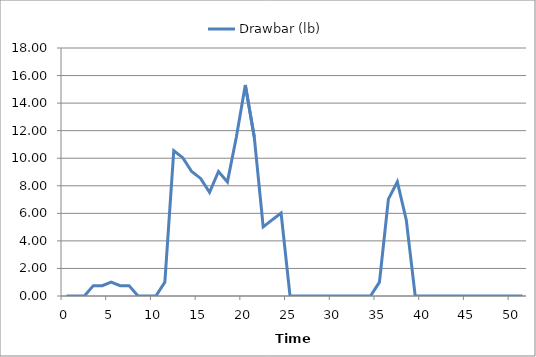
| Category | Drawbar (lb) |
|---|---|
| 0.0 | 0 |
| 1.0 | 0 |
| 2.0 | 0 |
| 3.0 | 0.753 |
| 4.0 | 0.753 |
| 5.0 | 1.004 |
| 6.0 | 0.753 |
| 7.0 | 0.753 |
| 8.0 | 0 |
| 9.0 | 0 |
| 10.0 | 0 |
| 11.0 | 1.004 |
| 12.0 | 10.541 |
| 13.0 | 10.039 |
| 14.0 | 9.035 |
| 15.0 | 8.533 |
| 16.0 | 7.529 |
| 17.0 | 9.035 |
| 18.0 | 8.282 |
| 19.0 | 11.545 |
| 20.0 | 15.31 |
| 21.0 | 11.545 |
| 22.0 | 5.02 |
| 23.0 | 5.522 |
| 24.0 | 6.024 |
| 25.0 | 0 |
| 26.0 | 0 |
| 27.0 | 0 |
| 28.0 | 0 |
| 29.0 | 0 |
| 30.0 | 0 |
| 31.0 | 0 |
| 32.0 | 0 |
| 33.0 | 0 |
| 34.0 | 0 |
| 35.0 | 1.004 |
| 36.0 | 7.027 |
| 37.0 | 8.282 |
| 38.0 | 5.522 |
| 39.0 | 0 |
| 40.0 | 0 |
| 41.0 | 0 |
| 42.0 | 0 |
| 43.0 | 0 |
| 44.0 | 0 |
| 45.0 | 0 |
| 46.0 | 0 |
| 47.0 | 0 |
| 48.0 | 0 |
| 49.0 | 0 |
| 50.0 | 0 |
| 51.0 | 0 |